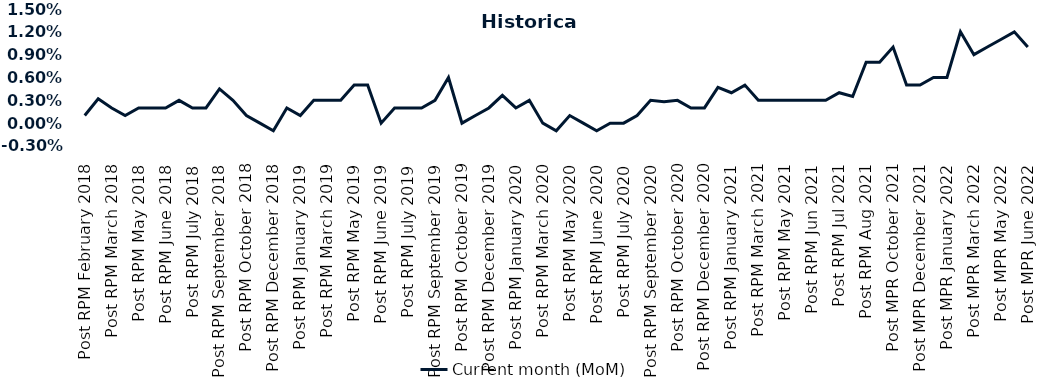
| Category | Current month (MoM)  |
|---|---|
| Post RPM February 2018 | 0.001 |
| Pre RPM March 2018 | 0.003 |
| Post RPM March 2018 | 0.002 |
| Pre RPM May 2018 | 0.001 |
| Post RPM May 2018 | 0.002 |
| Pre RPM June 2018 | 0.002 |
| Post RPM June 2018 | 0.002 |
| Pre RPM July 2018 | 0.003 |
| Post RPM July 2018 | 0.002 |
| Pre RPM September 2018 | 0.002 |
| Post RPM September 2018 | 0.004 |
| Pre RPM October 2018 | 0.003 |
| Post RPM October 2018 | 0.001 |
| Pre RPM December 2018 | 0 |
| Post RPM December 2018 | -0.001 |
| Pre RPM January 2019 | 0.002 |
| Post RPM January 2019 | 0.001 |
| Pre RPM March 2019 | 0.003 |
| Post RPM March 2019 | 0.003 |
| Pre RPM May 2019 | 0.003 |
| Post RPM May 2019 | 0.005 |
| Pre RPM June 2019 | 0.005 |
| Post RPM June 2019 | 0 |
| Pre RPM July 2019 | 0.002 |
| Post RPM July 2019 | 0.002 |
| Pre RPM September 2019 | 0.002 |
| Post RPM September 2019 | 0.003 |
| Pre RPM October 2019 | 0.006 |
| Post RPM October 2019 | 0 |
| Pre RPM December 2019 | 0.001 |
| Post RPM December 2019 | 0.002 |
| Pre RPM January 2020 | 0.004 |
| Post RPM January 2020 | 0.002 |
| Pre RPM March 2020 | 0.003 |
| Post RPM March 2020 | 0 |
| Pre RPM May 2020 | -0.001 |
| Post RPM May 2020 | 0.001 |
| Pre RPM June 2020 | 0 |
| Post RPM June 2020 | -0.001 |
| Pre RPM July 2020 | 0 |
| Post RPM July 2020 | 0 |
| Pre RPM September 2020 | 0.001 |
| Post RPM September 2020 | 0.003 |
| Pre RPM October 2020 | 0.003 |
| Post RPM October 2020 | 0.003 |
| Pre RPM December 2020 | 0.002 |
|  Post RPM December 2020 | 0.002 |
| Pre RPM January 2021 | 0.005 |
| Post RPM January 2021 | 0.004 |
|  Pre RPM March 2021 | 0.005 |
|  Post RPM March 2021 | 0.003 |
|  Pre RPM May 2021 | 0.003 |
|  Post RPM May 2021 | 0.003 |
|  Pre RPM Jun 2021 | 0.003 |
|   Post RPM Jun 2021 | 0.003 |
| Pre RPM Jul 2021 | 0.003 |
|  Post RPM Jul 2021 | 0.004 |
| Pre RPM Aug 2021 | 0.004 |
|  Post RPM Aug 2021 | 0.008 |
| Pre MPR October 2021 | 0.008 |
| Post MPR October 2021 | 0.01 |
| Pre MPR December 2021 | 0.005 |
| Post MPR December 2021 | 0.005 |
| Pre MPR January 2022 | 0.006 |
| Post MPR January 2022 | 0.006 |
| Pre MPR March 2022 | 0.012 |
| Post MPR March 2022 | 0.009 |
| Pre MPR May 2022 | 0.01 |
| Post MPR May 2022 | 0.011 |
| Pre MPR June 2022 | 0.012 |
| Post MPR June 2022 | 0.01 |